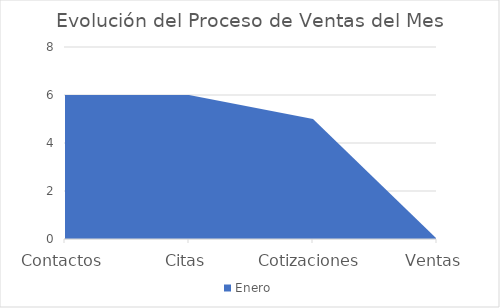
| Category | Enero |
|---|---|
| Contactos | 6 |
| Citas | 6 |
| Cotizaciones | 5 |
| Ventas | 0 |